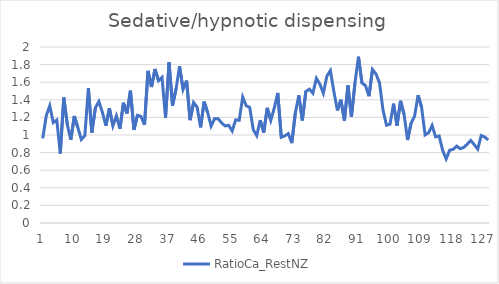
| Category | RatioCa_RestNZ |
|---|---|
| 0 | 0.961 |
| 1 | 1.218 |
| 2 | 1.332 |
| 3 | 1.141 |
| 4 | 1.17 |
| 5 | 0.79 |
| 6 | 1.426 |
| 7 | 1.118 |
| 8 | 0.946 |
| 9 | 1.216 |
| 10 | 1.085 |
| 11 | 0.95 |
| 12 | 0.992 |
| 13 | 1.532 |
| 14 | 1.027 |
| 15 | 1.309 |
| 16 | 1.381 |
| 17 | 1.258 |
| 18 | 1.105 |
| 19 | 1.304 |
| 20 | 1.103 |
| 21 | 1.217 |
| 22 | 1.071 |
| 23 | 1.366 |
| 24 | 1.245 |
| 25 | 1.504 |
| 26 | 1.058 |
| 27 | 1.224 |
| 28 | 1.211 |
| 29 | 1.115 |
| 30 | 1.729 |
| 31 | 1.545 |
| 32 | 1.75 |
| 33 | 1.617 |
| 34 | 1.656 |
| 35 | 1.193 |
| 36 | 1.826 |
| 37 | 1.335 |
| 38 | 1.524 |
| 39 | 1.781 |
| 40 | 1.519 |
| 41 | 1.619 |
| 42 | 1.168 |
| 43 | 1.369 |
| 44 | 1.317 |
| 45 | 1.087 |
| 46 | 1.379 |
| 47 | 1.257 |
| 48 | 1.102 |
| 49 | 1.186 |
| 50 | 1.185 |
| 51 | 1.137 |
| 52 | 1.103 |
| 53 | 1.11 |
| 54 | 1.046 |
| 55 | 1.172 |
| 56 | 1.167 |
| 57 | 1.431 |
| 58 | 1.332 |
| 59 | 1.314 |
| 60 | 1.062 |
| 61 | 0.993 |
| 62 | 1.169 |
| 63 | 1.028 |
| 64 | 1.308 |
| 65 | 1.166 |
| 66 | 1.306 |
| 67 | 1.478 |
| 68 | 0.974 |
| 69 | 0.99 |
| 70 | 1.016 |
| 71 | 0.908 |
| 72 | 1.249 |
| 73 | 1.45 |
| 74 | 1.165 |
| 75 | 1.495 |
| 76 | 1.521 |
| 77 | 1.475 |
| 78 | 1.644 |
| 79 | 1.578 |
| 80 | 1.475 |
| 81 | 1.669 |
| 82 | 1.732 |
| 83 | 1.491 |
| 84 | 1.279 |
| 85 | 1.4 |
| 86 | 1.162 |
| 87 | 1.563 |
| 88 | 1.206 |
| 89 | 1.589 |
| 90 | 1.89 |
| 91 | 1.59 |
| 92 | 1.562 |
| 93 | 1.441 |
| 94 | 1.745 |
| 95 | 1.693 |
| 96 | 1.593 |
| 97 | 1.284 |
| 98 | 1.111 |
| 99 | 1.123 |
| 100 | 1.356 |
| 101 | 1.107 |
| 102 | 1.389 |
| 103 | 1.236 |
| 104 | 0.943 |
| 105 | 1.133 |
| 106 | 1.213 |
| 107 | 1.453 |
| 108 | 1.313 |
| 109 | 1.001 |
| 110 | 1.026 |
| 111 | 1.108 |
| 112 | 0.979 |
| 113 | 0.989 |
| 114 | 0.825 |
| 115 | 0.728 |
| 116 | 0.827 |
| 117 | 0.837 |
| 118 | 0.874 |
| 119 | 0.844 |
| 120 | 0.858 |
| 121 | 0.895 |
| 122 | 0.938 |
| 123 | 0.891 |
| 124 | 0.84 |
| 125 | 0.995 |
| 126 | 0.976 |
| 127 | 0.945 |